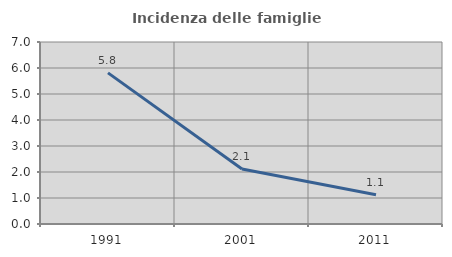
| Category | Incidenza delle famiglie numerose |
|---|---|
| 1991.0 | 5.812 |
| 2001.0 | 2.116 |
| 2011.0 | 1.124 |